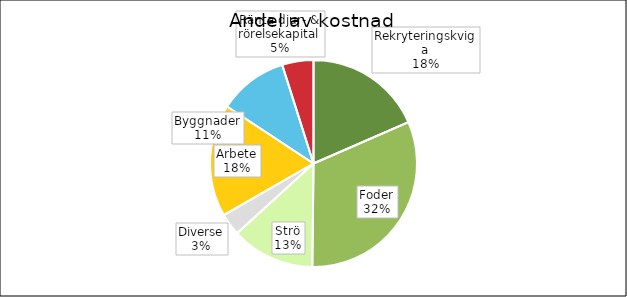
| Category | Värde, kr |
|---|---|
| Rekryteringskviga | 3779 |
| Foder | 6492.1 |
| Strö | 2670 |
| Diverse | 710 |
| Arbete | 3600 |
| Byggnader | 2216.667 |
| Ränta djur- & rörelsekapital | 1001.342 |